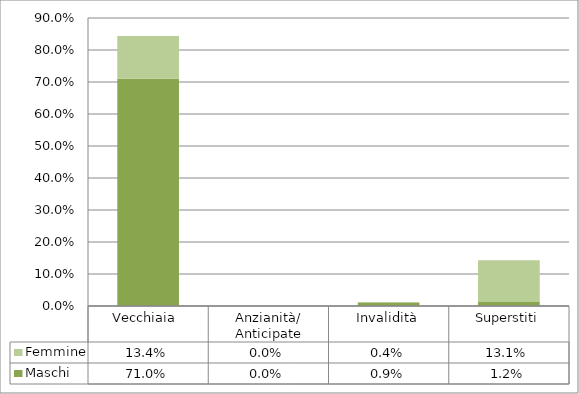
| Category | Maschi | Femmine |
|---|---|---|
| Vecchiaia  | 0.71 | 0.134 |
| Anzianità/ Anticipate | 0 | 0 |
| Invalidità | 0.009 | 0.004 |
| Superstiti | 0.012 | 0.131 |